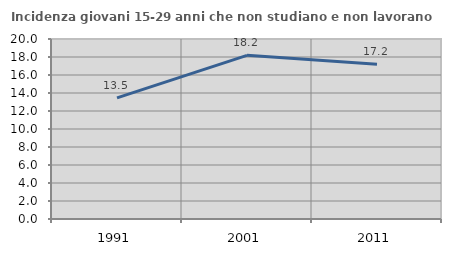
| Category | Incidenza giovani 15-29 anni che non studiano e non lavorano  |
|---|---|
| 1991.0 | 13.453 |
| 2001.0 | 18.182 |
| 2011.0 | 17.188 |